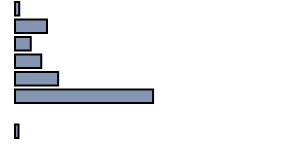
| Category | Series 0 |
|---|---|
| 0 | 1.6 |
| 1 | 12.2 |
| 2 | 6 |
| 3 | 10 |
| 4 | 16.4 |
| 5 | 52.5 |
| 6 | 0 |
| 7 | 1.3 |